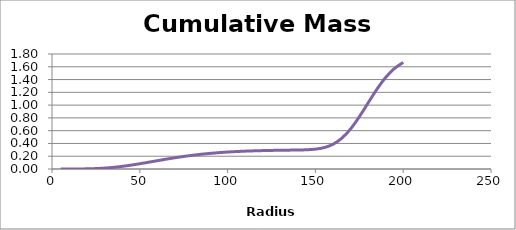
| Category | Series 3 |
|---|---|
| 5.0 | 0 |
| 10.0 | 0 |
| 15.0 | 0.001 |
| 20.0 | 0.002 |
| 25.0 | 0.007 |
| 30.0 | 0.014 |
| 35.0 | 0.026 |
| 40.0 | 0.041 |
| 45.0 | 0.061 |
| 50.0 | 0.082 |
| 55.0 | 0.106 |
| 60.0 | 0.13 |
| 65.0 | 0.154 |
| 70.0 | 0.176 |
| 75.0 | 0.197 |
| 80.0 | 0.215 |
| 85.0 | 0.231 |
| 90.0 | 0.245 |
| 95.0 | 0.256 |
| 100.0 | 0.266 |
| 105.0 | 0.273 |
| 110.0 | 0.279 |
| 115.0 | 0.284 |
| 120.0 | 0.288 |
| 125.0 | 0.291 |
| 130.0 | 0.293 |
| 135.0 | 0.295 |
| 140.0 | 0.297 |
| 145.0 | 0.301 |
| 150.0 | 0.311 |
| 155.0 | 0.335 |
| 160.0 | 0.387 |
| 165.0 | 0.481 |
| 170.0 | 0.626 |
| 175.0 | 0.817 |
| 180.0 | 1.034 |
| 185.0 | 1.248 |
| 190.0 | 1.432 |
| 195.0 | 1.573 |
| 200.0 | 1.668 |